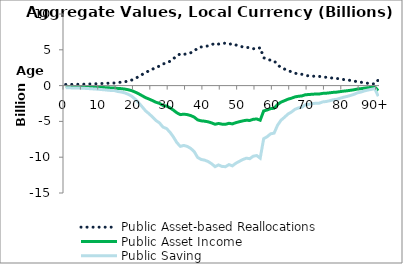
| Category | Public Asset-based Reallocations | Public Asset Income | Public Saving |
|---|---|---|---|
| 0 | 153.308 | -139.891 | -293.199 |
|  | 160.479 | -146.434 | -306.913 |
| 2 | 171.886 | -156.843 | -328.729 |
| 3 | 174.735 | -159.442 | -334.177 |
| 4 | 183.033 | -167.015 | -350.048 |
| 5 | 194.706 | -177.665 | -372.371 |
| 6 | 208.045 | -189.838 | -397.883 |
| 7 | 225.064 | -205.367 | -430.431 |
| 8 | 242.611 | -221.378 | -463.988 |
| 9 | 259.748 | -237.015 | -496.763 |
| 10 | 281.939 | -257.265 | -539.204 |
| 11 | 304.557 | -277.902 | -582.459 |
| 12 | 330.235 | -301.333 | -631.568 |
| 13 | 356.837 | -325.608 | -682.445 |
| 14 | 362.292 | -330.585 | -692.877 |
| 15 | 433.42 | -395.488 | -828.908 |
| 16 | 467.909 | -426.959 | -894.868 |
| 17 | 531.221 | -484.73 | -1015.951 |
| 18 | 634.501 | -578.972 | -1213.473 |
| 19 | 773.537 | -705.839 | -1479.376 |
| 20 | 993.597 | -906.64 | -1900.237 |
| 21 | 1253.074 | -1143.409 | -2396.483 |
| 22 | 1546.962 | -1411.576 | -2958.538 |
| 23 | 1846.361 | -1684.772 | -3531.132 |
| 24 | 2058.628 | -1878.462 | -3937.09 |
| 25 | 2297.475 | -2096.405 | -4393.88 |
| 26 | 2549.868 | -2326.709 | -4876.577 |
| 27 | 2725.908 | -2487.342 | -5213.25 |
| 28 | 3029.515 | -2764.38 | -5793.895 |
| 29 | 3132.6 | -2858.444 | -5991.044 |
| 30 | 3396.759 | -3099.485 | -6496.245 |
| 31 | 3749.536 | -3421.387 | -7170.923 |
| 32 | 4163.46 | -3799.086 | -7962.546 |
| 33 | 4439.257 | -4050.743 | -8490 |
| 34 | 4369.1 | -3986.727 | -8355.827 |
| 35 | 4441.408 | -4052.709 | -8494.117 |
| 36 | 4587.734 | -4186.231 | -8773.965 |
| 37 | 4826.231 | -4403.857 | -9230.088 |
| 38 | 5250.538 | -4791.021 | -10041.559 |
| 39 | 5393.602 | -4921.566 | -10315.168 |
| 40 | 5444.733 | -4968.225 | -10412.958 |
| 41 | 5544.634 | -5059.379 | -10604.013 |
| 42 | 5706.271 | -5206.872 | -10913.143 |
| 43 | 5917.563 | -5399.669 | -11317.232 |
| 44 | 5794.621 | -5287.491 | -11082.112 |
| 45 | 5903.989 | -5387.291 | -11291.28 |
| 46 | 5922.146 | -5403.857 | -11326.003 |
| 47 | 5770.218 | -5265.225 | -11035.443 |
| 48 | 5860.207 | -5347.339 | -11207.546 |
| 49 | 5667.883 | -5171.844 | -10839.727 |
| 50 | 5530.762 | -5046.722 | -10577.485 |
| 51 | 5399.309 | -4926.776 | -10326.084 |
| 52 | 5300.446 | -4836.564 | -10137.01 |
| 53 | 5337.79 | -4870.639 | -10208.429 |
| 54 | 5155.796 | -4704.579 | -9860.374 |
| 55 | 5107.833 | -4660.807 | -9768.64 |
| 56 | 5301.016 | -4837.084 | -10138.1 |
| 57 | 3879.339 | -3539.833 | -7419.171 |
| 58 | 3732.214 | -3405.581 | -7137.796 |
| 59 | 3523.536 | -3215.166 | -6738.702 |
| 60 | 3471.459 | -3167.647 | -6639.107 |
| 61 | 2894.582 | -2641.257 | -5535.839 |
| 62 | 2526.771 | -2305.635 | -4832.406 |
| 63 | 2311.817 | -2109.493 | -4421.31 |
| 64 | 2077.691 | -1895.857 | -3973.547 |
| 65 | 1930.181 | -1761.257 | -3691.438 |
| 66 | 1732.959 | -1581.295 | -3314.255 |
| 67 | 1633.598 | -1490.631 | -3124.229 |
| 68 | 1579.28 | -1441.065 | -3020.344 |
| 69 | 1401.982 | -1279.285 | -2681.267 |
| 70 | 1366.398 | -1246.814 | -2613.212 |
| 71 | 1323.471 | -1207.644 | -2531.115 |
| 72 | 1286.928 | -1174.299 | -2461.226 |
| 73 | 1282.14 | -1169.93 | -2452.07 |
| 74 | 1190.984 | -1086.752 | -2277.736 |
| 75 | 1162.851 | -1061.081 | -2223.933 |
| 76 | 1106.134 | -1009.329 | -2115.463 |
| 77 | 1036.206 | -945.52 | -1981.726 |
| 78 | 998.761 | -911.352 | -1910.113 |
| 79 | 925.195 | -844.224 | -1769.419 |
| 80 | 849.006 | -774.703 | -1623.709 |
| 81 | 791.724 | -722.434 | -1514.157 |
| 82 | 719.499 | -656.53 | -1376.029 |
| 83 | 640.672 | -584.602 | -1225.274 |
| 84 | 527.656 | -481.477 | -1009.133 |
| 85 | 473.516 | -432.075 | -905.591 |
| 86 | 389.762 | -355.651 | -745.413 |
| 87 | 326.902 | -298.292 | -625.195 |
| 88 | 274.36 | -250.349 | -524.71 |
| 89 | 219.197 | -200.013 | -419.21 |
| 90+ | 780.483 | -712.178 | -1492.661 |